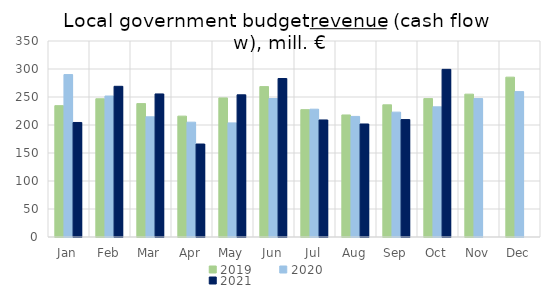
| Category | 2019 | 2020 | 2021 |
|---|---|---|---|
| Jan | 234552.318 | 290064.145 | 204517.329 |
| Feb | 246822.414 | 251741.549 | 269110.565 |
| Mar | 238170.318 | 214628.306 | 255479.297 |
| Apr | 215841.719 | 205049 | 166036.194 |
| May | 248360.561 | 203771.42 | 253889.01 |
| Jun | 268532.67 | 247277.58 | 283015.617 |
| Jul | 227382.633 | 228229.354 | 209024.05 |
| Aug | 217917.802 | 215329.064 | 201829.938 |
| Sep | 236011.565 | 222973.772 | 209634.733 |
| Oct | 247128.221 | 232443.755 | 299380.785 |
| Nov | 255089.776 | 247188.407 | 0 |
| Dec | 285439.278 | 259624.166 | 0 |